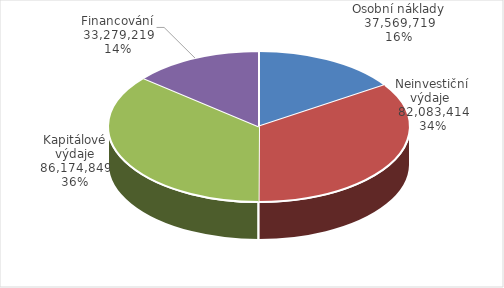
| Category | Series 0 |
|---|---|
| Osobní náklady | 37569718.8 |
| Neinvestiční výdaje  | 82083414.304 |
| Kapitálové výdaje | 86174849 |
| Financování | 33279218.896 |